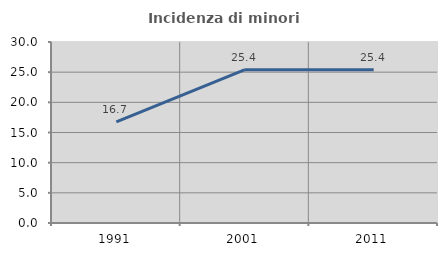
| Category | Incidenza di minori stranieri |
|---|---|
| 1991.0 | 16.746 |
| 2001.0 | 25.409 |
| 2011.0 | 25.408 |